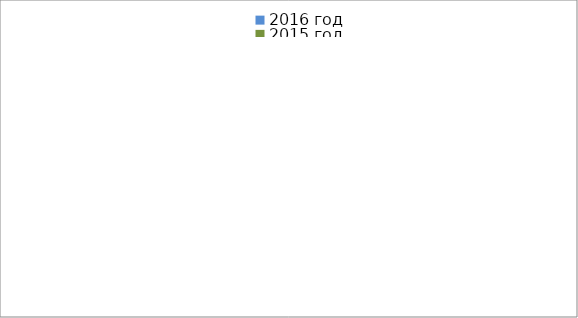
| Category | 2016 год | 2015 год |
|---|---|---|
|  - поджог | 28 | 18 |
|  - неосторожное обращение с огнём | 19 | 40 |
|  - НПТЭ электрооборудования | 11 | 9 |
|  - НПУ и Э печей | 27 | 30 |
|  - НПУ и Э транспортных средств | 18 | 32 |
|   -Шалость с огнем детей | 5 | 3 |
|  -НППБ при эксплуатации эл.приборов | 8 | 12 |
|  - курение | 9 | 17 |
| - прочие | 61 | 60 |
| - не установленные причины | 12 | 8 |